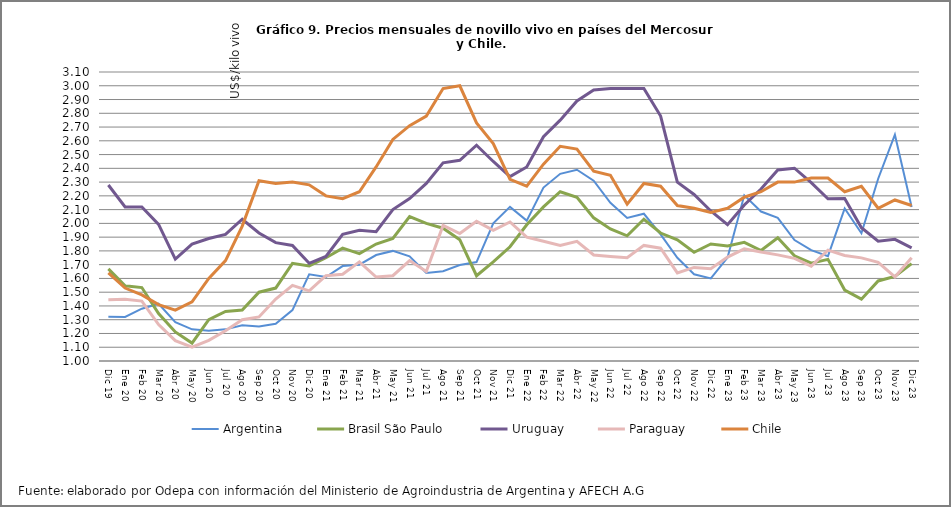
| Category | Argentina | Brasil São Paulo | Uruguay | Paraguay | Chile |
|---|---|---|---|---|---|
| Dic 19 | 1.321 | 1.67 | 2.279 | 1.445 | 1.64 |
| Ene 20 | 1.32 | 1.547 | 2.119 | 1.448 | 1.53 |
| Feb 20 | 1.38 | 1.534 | 2.119 | 1.435 | 1.48 |
| Mar 20 | 1.416 | 1.345 | 1.993 | 1.265 | 1.41 |
| Abr 20 | 1.282 | 1.211 | 1.74 | 1.148 | 1.37 |
| May 20 | 1.23 | 1.13 | 1.85 | 1.1 | 1.43 |
| Jun 20 | 1.22 | 1.3 | 1.89 | 1.15 | 1.6 |
| Jul 20 | 1.23 | 1.36 | 1.92 | 1.22 | 1.73 |
| Ago 20 | 1.26 | 1.37 | 2.03 | 1.3 | 1.98 |
| Sep 20 | 1.25 | 1.5 | 1.93 | 1.32 | 2.31 |
| Oct 20 | 1.27 | 1.53 | 1.86 | 1.45 | 2.29 |
| Nov 20 | 1.37 | 1.71 | 1.84 | 1.55 | 2.3 |
| Dic 20 | 1.63 | 1.69 | 1.71 | 1.51 | 2.28 |
| Ene 21 | 1.61 | 1.75 | 1.76 | 1.62 | 2.2 |
| Feb 21 | 1.69 | 1.82 | 1.92 | 1.63 | 2.18 |
| Mar 21 | 1.7 | 1.78 | 1.95 | 1.72 | 2.23 |
| Abr 21 | 1.77 | 1.85 | 1.94 | 1.61 | 2.41 |
| May 21 | 1.8 | 1.89 | 2.1 | 1.62 | 2.61 |
| Jun 21 | 1.76 | 2.05 | 2.18 | 1.73 | 2.71 |
| Jul 21 | 1.64 | 2 | 2.29 | 1.65 | 2.78 |
| Ago 21 | 1.652 | 1.965 | 2.44 | 1.985 | 2.98 |
| Sep 21 | 1.697 | 1.882 | 2.458 | 1.926 | 3 |
| Oct 21 | 1.719 | 1.619 | 2.568 | 2.015 | 2.73 |
| Nov 21 | 2 | 1.72 | 2.45 | 1.95 | 2.58 |
| Dic 21 | 2.12 | 1.83 | 2.34 | 2.01 | 2.32 |
| Ene 22 | 2.02 | 1.99 | 2.41 | 1.9 | 2.27 |
| Feb 22 | 2.26 | 2.12 | 2.63 | 1.87 | 2.43 |
| Mar 22 | 2.36 | 2.23 | 2.75 | 1.84 | 2.56 |
| Abr 22 | 2.39 | 2.19 | 2.89 | 1.87 | 2.54 |
| May 22 | 2.31 | 2.04 | 2.97 | 1.77 | 2.38 |
| Jun 22 | 2.15 | 1.96 | 2.98 | 1.76 | 2.35 |
| Jul 22 | 2.04 | 1.91 | 2.98 | 1.75 | 2.14 |
| Ago 22 | 2.07 | 2.03 | 2.98 | 1.84 | 2.29 |
| Sep 22 | 1.92 | 1.93 | 2.78 | 1.82 | 2.27 |
| Oct 22 | 1.75 | 1.88 | 2.3 | 1.64 | 2.13 |
| Nov 22 | 1.63 | 1.79 | 2.21 | 1.68 | 2.11 |
| Dic 22 | 1.6 | 1.85 | 2.09 | 1.67 | 2.08 |
| Ene 23 | 1.752 | 1.835 | 1.99 | 1.755 | 2.11 |
| Feb 23 | 2.204 | 1.862 | 2.134 | 1.815 | 2.19 |
| Mar 23 | 2.086 | 1.803 | 2.25 | 1.792 | 2.23 |
| Abr 23 | 2.04 | 1.895 | 2.388 | 1.771 | 2.3 |
| May 23 | 1.879 | 1.764 | 2.401 | 1.746 | 2.3 |
| Jun 23 | 1.806 | 1.71 | 2.296 | 1.689 | 2.33 |
| Jul 23 | 1.762 | 1.738 | 2.179 | 1.806 | 2.33 |
| Ago 23 | 2.108 | 1.515 | 2.181 | 1.767 | 2.23 |
| Sep 23 | 1.928 | 1.449 | 1.969 | 1.75 | 2.27 |
| Oct 23 | 2.324 | 1.582 | 1.87 | 1.717 | 2.11 |
| Nov 23 | 2.644 | 1.614 | 1.884 | 1.611 | 2.17 |
| Dic 23 | 2.119 | 1.707 | 1.822 | 1.751 | 2.13 |